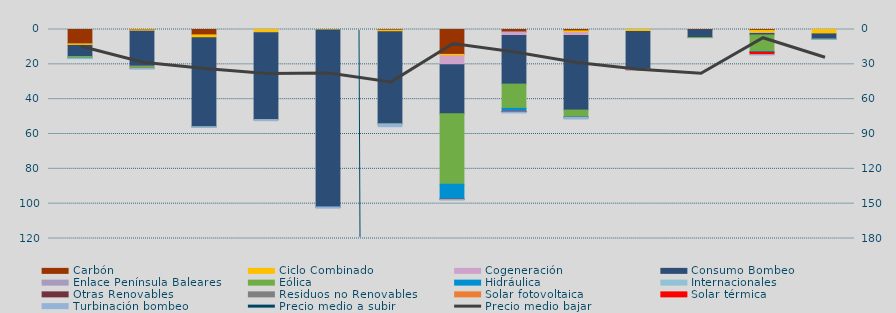
| Category | Carbón | Ciclo Combinado | Cogeneración | Consumo Bombeo | Enlace Península Baleares | Eólica | Hidráulica | Internacionales | Otras Renovables | Residuos no Renovables | Solar fotovoltaica | Solar térmica | Turbinación bombeo |
|---|---|---|---|---|---|---|---|---|---|---|---|---|---|
| 0 | 8244.2 | 904.8 | 2.7 | 6336.3 | 0 | 978.8 | 40 |  | 0 | 0 | 0 | 0 | 211.7 |
| 1 | 208.4 | 783.8 | 39.5 | 20030 | 213.5 | 1049.8 | 0 |  | 0 | 0 | 0 | 34.2 | 399.9 |
| 2 | 3100.2 | 1575.6 | 0 | 51191.5 | 0 | 12.5 | 0 |  | 0 | 0 | 0 | 0 | 347.6 |
| 3 | 0 | 1898.2 | 24.2 | 49736.3 | 0 | 105.1 | 0 |  | 0 | 0 | 0.1 | 0 | 619.4 |
| 4 | 0 | 331 | 0 | 101506.1 | 204 | 0 | 106.7 |  | 0 | 0 | 0 | 0 | 462.2 |
| 5 | 376.2 | 910.9 | 0 | 52921.9 | 0 | 42.8 | 0 |  | 0 | 0 | 0 | 0 | 1542.2 |
| 6 | 14289.6 | 859.1 | 5068.8 | 28184.1 | 0 | 40432 | 8486.1 |  | 49.4 | 334.8 | 0 | 0 | 110.8 |
| 7 | 1420.9 | 0 | 2008.3 | 27920 | 0 | 13960.1 | 1762.8 |  | 22.7 | 98.3 | 0 | 224.2 | 474.7 |
| 8 | 808.2 | 1016.6 | 1618.6 | 42815.3 | 0 | 4070.8 | 105.9 |  | 51.2 | 12.8 | 0 | 0 | 879 |
| 9 | 0 | 1097.9 | 0 | 21404.4 | 0 | 137.4 | 0 |  | 0 | 0 | 0 | 518.8 | 108.8 |
| 10 | 294.2 | 0 | 0 | 4310.8 | 42.4 | 0.6 | 0 |  | 0 | 0 | 0 | 0 | 0 |
| 11 | 516.7 | 1537.9 | 257 | 809.6 | 0 | 9502.9 | 408.7 |  | 117.5 | 0 | 0.4 | 1254.7 | 102.9 |
| 12 | 0 | 2533.1 | 0 | 2991.4 | 0 | 42.6 | 0 |  | 0 | 0 | 0 | 0 | 65 |